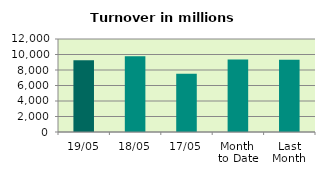
| Category | Series 0 |
|---|---|
| 19/05 | 9273.83 |
| 18/05 | 9771.201 |
| 17/05 | 7508.966 |
| Month 
to Date | 9349.76 |
| Last
Month | 9311.354 |